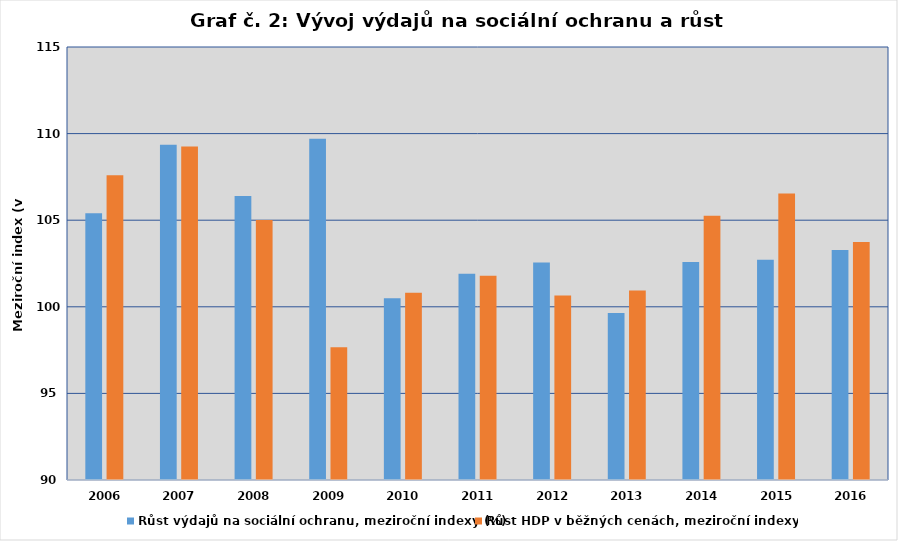
| Category | Růst výdajů na sociální ochranu, meziroční indexy (%) | Růst HDP v běžných cenách, meziroční indexy (%) |
|---|---|---|
| 2006.0 | 105.4 | 107.6 |
| 2007.0 | 109.356 | 109.258 |
| 2008.0 | 106.391 | 105.018 |
| 2009.0 | 109.707 | 97.671 |
| 2010.0 | 100.495 | 100.816 |
| 2011.0 | 101.908 | 101.799 |
| 2012.0 | 102.556 | 100.648 |
| 2013.0 | 99.649 | 100.941 |
| 2014.0 | 102.581 | 105.262 |
| 2015.0 | 102.721 | 106.537 |
| 2016.0 | 103.285 | 103.747 |